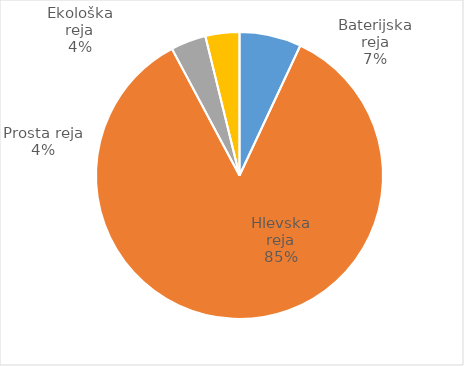
| Category | Število kosov jajc |
|---|---|
| Baterijska reja | 230928 |
| Hlevska reja | 2824899 |
| Prosta reja | 131595 |
| Ekološka reja | 126840 |